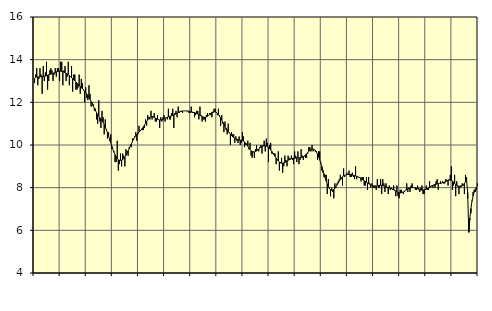
| Category | Tillverkning av verkstadsvaror, SNI 25-30, 33 | Series 1 |
|---|---|---|
| nan | 12.9 | 13.12 |
| 87.0 | 13.3 | 13.18 |
| 87.0 | 13.6 | 13.19 |
| 87.0 | 12.8 | 13.19 |
| 87.0 | 13.1 | 13.19 |
| 87.0 | 13.6 | 13.2 |
| 87.0 | 13.3 | 13.2 |
| 87.0 | 12.4 | 13.2 |
| 87.0 | 13.7 | 13.21 |
| 87.0 | 13 | 13.22 |
| 87.0 | 13.4 | 13.23 |
| 87.0 | 13.9 | 13.25 |
| nan | 12.6 | 13.27 |
| 88.0 | 13 | 13.29 |
| 88.0 | 13.5 | 13.31 |
| 88.0 | 13.6 | 13.32 |
| 88.0 | 13.5 | 13.34 |
| 88.0 | 13 | 13.36 |
| 88.0 | 13.3 | 13.38 |
| 88.0 | 13.6 | 13.4 |
| 88.0 | 13.2 | 13.43 |
| 88.0 | 13.6 | 13.44 |
| 88.0 | 13.6 | 13.46 |
| 88.0 | 13 | 13.46 |
| nan | 13.9 | 13.46 |
| 89.0 | 13.9 | 13.45 |
| 89.0 | 12.8 | 13.44 |
| 89.0 | 13.5 | 13.42 |
| 89.0 | 13.7 | 13.39 |
| 89.0 | 13 | 13.36 |
| 89.0 | 13.2 | 13.34 |
| 89.0 | 13.9 | 13.3 |
| 89.0 | 12.8 | 13.26 |
| 89.0 | 13.2 | 13.21 |
| 89.0 | 13.7 | 13.16 |
| 89.0 | 12.5 | 13.1 |
| nan | 13.3 | 13.05 |
| 90.0 | 13.3 | 13 |
| 90.0 | 12.6 | 12.95 |
| 90.0 | 12.6 | 12.9 |
| 90.0 | 12.7 | 12.85 |
| 90.0 | 13.3 | 12.79 |
| 90.0 | 12.4 | 12.74 |
| 90.0 | 13.1 | 12.69 |
| 90.0 | 12.9 | 12.63 |
| 90.0 | 12.6 | 12.58 |
| 90.0 | 12 | 12.52 |
| 90.0 | 12.7 | 12.46 |
| nan | 12.2 | 12.39 |
| 91.0 | 12.1 | 12.31 |
| 91.0 | 12.8 | 12.23 |
| 91.0 | 12.4 | 12.14 |
| 91.0 | 11.8 | 12.04 |
| 91.0 | 12 | 11.94 |
| 91.0 | 11.9 | 11.82 |
| 91.0 | 11.6 | 11.71 |
| 91.0 | 11.7 | 11.61 |
| 91.0 | 11.2 | 11.51 |
| 91.0 | 11 | 11.42 |
| 91.0 | 12.1 | 11.35 |
| nan | 11.1 | 11.28 |
| 92.0 | 10.8 | 11.21 |
| 92.0 | 11.6 | 11.14 |
| 92.0 | 11.3 | 11.06 |
| 92.0 | 10.5 | 10.96 |
| 92.0 | 11.2 | 10.85 |
| 92.0 | 10.7 | 10.72 |
| 92.0 | 10.3 | 10.57 |
| 92.0 | 10.6 | 10.42 |
| 92.0 | 10.2 | 10.26 |
| 92.0 | 10.5 | 10.1 |
| 92.0 | 9.8 | 9.95 |
| nan | 9.8 | 9.8 |
| 93.0 | 9.7 | 9.66 |
| 93.0 | 9.2 | 9.54 |
| 93.0 | 9.2 | 9.44 |
| 93.0 | 10.2 | 9.37 |
| 93.0 | 8.8 | 9.31 |
| 93.0 | 9.1 | 9.28 |
| 93.0 | 9.6 | 9.28 |
| 93.0 | 9 | 9.29 |
| 93.0 | 9.6 | 9.32 |
| 93.0 | 9.5 | 9.37 |
| 93.0 | 9 | 9.43 |
| nan | 9.8 | 9.51 |
| 94.0 | 9.7 | 9.61 |
| 94.0 | 9.5 | 9.72 |
| 94.0 | 9.9 | 9.83 |
| 94.0 | 10 | 9.95 |
| 94.0 | 9.9 | 10.06 |
| 94.0 | 10.3 | 10.17 |
| 94.0 | 10.3 | 10.27 |
| 94.0 | 10.4 | 10.36 |
| 94.0 | 10.6 | 10.44 |
| 94.0 | 10.2 | 10.5 |
| 94.0 | 10.5 | 10.56 |
| nan | 10.9 | 10.61 |
| 95.0 | 10.7 | 10.66 |
| 95.0 | 10.7 | 10.71 |
| 95.0 | 10.7 | 10.78 |
| 95.0 | 10.7 | 10.85 |
| 95.0 | 10.8 | 10.93 |
| 95.0 | 11.2 | 11.02 |
| 95.0 | 10.9 | 11.1 |
| 95.0 | 11.4 | 11.18 |
| 95.0 | 11.3 | 11.25 |
| 95.0 | 11.2 | 11.3 |
| 95.0 | 11.6 | 11.33 |
| nan | 11.2 | 11.34 |
| 96.0 | 11.3 | 11.33 |
| 96.0 | 11.5 | 11.3 |
| 96.0 | 11.1 | 11.27 |
| 96.0 | 11.1 | 11.24 |
| 96.0 | 11.4 | 11.21 |
| 96.0 | 11.2 | 11.18 |
| 96.0 | 10.8 | 11.17 |
| 96.0 | 11.3 | 11.17 |
| 96.0 | 11.1 | 11.18 |
| 96.0 | 11.3 | 11.2 |
| 96.0 | 11.4 | 11.23 |
| nan | 11.1 | 11.25 |
| 97.0 | 11.3 | 11.28 |
| 97.0 | 11.2 | 11.3 |
| 97.0 | 11.7 | 11.32 |
| 97.0 | 11.2 | 11.34 |
| 97.0 | 11.2 | 11.35 |
| 97.0 | 11.5 | 11.37 |
| 97.0 | 11.7 | 11.39 |
| 97.0 | 10.8 | 11.41 |
| 97.0 | 11.5 | 11.44 |
| 97.0 | 11.6 | 11.46 |
| 97.0 | 11.3 | 11.49 |
| nan | 11.8 | 11.52 |
| 98.0 | 11.5 | 11.55 |
| 98.0 | 11.6 | 11.57 |
| 98.0 | 11.6 | 11.58 |
| 98.0 | 11.5 | 11.59 |
| 98.0 | 11.6 | 11.6 |
| 98.0 | 11.6 | 11.6 |
| 98.0 | 11.6 | 11.6 |
| 98.0 | 11.6 | 11.59 |
| 98.0 | 11.6 | 11.59 |
| 98.0 | 11.5 | 11.58 |
| 98.0 | 11.5 | 11.56 |
| nan | 11.8 | 11.55 |
| 99.0 | 11.5 | 11.54 |
| 99.0 | 11.5 | 11.53 |
| 99.0 | 11.3 | 11.52 |
| 99.0 | 11.4 | 11.5 |
| 99.0 | 11.6 | 11.48 |
| 99.0 | 11.6 | 11.45 |
| 99.0 | 11.2 | 11.42 |
| 99.0 | 11.8 | 11.39 |
| 99.0 | 11.4 | 11.36 |
| 99.0 | 11.1 | 11.33 |
| 99.0 | 11.2 | 11.31 |
| nan | 11.2 | 11.3 |
| 0.0 | 11.1 | 11.31 |
| 0.0 | 11.4 | 11.32 |
| 0.0 | 11.5 | 11.35 |
| 0.0 | 11.4 | 11.39 |
| 0.0 | 11.5 | 11.44 |
| 0.0 | 11.4 | 11.49 |
| 0.0 | 11.3 | 11.53 |
| 0.0 | 11.5 | 11.55 |
| 0.0 | 11.7 | 11.56 |
| 0.0 | 11.7 | 11.56 |
| 0.0 | 11.5 | 11.53 |
| nan | 11.4 | 11.49 |
| 1.0 | 11.7 | 11.43 |
| 1.0 | 11.4 | 11.35 |
| 1.0 | 10.9 | 11.26 |
| 1.0 | 11.4 | 11.17 |
| 1.0 | 11 | 11.07 |
| 1.0 | 10.6 | 10.97 |
| 1.0 | 11.1 | 10.87 |
| 1.0 | 10.7 | 10.79 |
| 1.0 | 10.5 | 10.71 |
| 1.0 | 11 | 10.63 |
| 1.0 | 10.6 | 10.57 |
| nan | 10 | 10.51 |
| 2.0 | 10.6 | 10.45 |
| 2.0 | 10.5 | 10.39 |
| 2.0 | 10.5 | 10.34 |
| 2.0 | 10.1 | 10.31 |
| 2.0 | 10.4 | 10.28 |
| 2.0 | 10.2 | 10.26 |
| 2.0 | 10.1 | 10.25 |
| 2.0 | 10.4 | 10.24 |
| 2.0 | 10 | 10.23 |
| 2.0 | 10.1 | 10.22 |
| 2.0 | 10.6 | 10.21 |
| nan | 10.4 | 10.18 |
| 3.0 | 9.9 | 10.14 |
| 3.0 | 10 | 10.09 |
| 3.0 | 10 | 10.02 |
| 3.0 | 10.2 | 9.94 |
| 3.0 | 9.8 | 9.86 |
| 3.0 | 10.1 | 9.79 |
| 3.0 | 9.5 | 9.73 |
| 3.0 | 9.4 | 9.69 |
| 3.0 | 9.7 | 9.67 |
| 3.0 | 9.4 | 9.67 |
| 3.0 | 9.8 | 9.69 |
| nan | 10 | 9.72 |
| 4.0 | 9.8 | 9.77 |
| 4.0 | 9.7 | 9.81 |
| 4.0 | 9.9 | 9.86 |
| 4.0 | 10 | 9.9 |
| 4.0 | 9.6 | 9.93 |
| 4.0 | 10 | 9.95 |
| 4.0 | 10.2 | 9.96 |
| 4.0 | 9.7 | 9.96 |
| 4.0 | 10.3 | 9.95 |
| 4.0 | 10.1 | 9.92 |
| 4.0 | 9.2 | 9.89 |
| nan | 10 | 9.83 |
| 5.0 | 10.1 | 9.77 |
| 5.0 | 9.6 | 9.7 |
| 5.0 | 9.6 | 9.63 |
| 5.0 | 9.6 | 9.54 |
| 5.0 | 9.6 | 9.46 |
| 5.0 | 9.1 | 9.39 |
| 5.0 | 9.3 | 9.32 |
| 5.0 | 9.7 | 9.25 |
| 5.0 | 8.8 | 9.2 |
| 5.0 | 9.2 | 9.16 |
| 5.0 | 9.4 | 9.15 |
| nan | 8.7 | 9.15 |
| 6.0 | 9 | 9.16 |
| 6.0 | 9.5 | 9.18 |
| 6.0 | 9.3 | 9.21 |
| 6.0 | 9 | 9.25 |
| 6.0 | 9.5 | 9.28 |
| 6.0 | 9.4 | 9.31 |
| 6.0 | 9.3 | 9.34 |
| 6.0 | 9.5 | 9.36 |
| 6.0 | 9.3 | 9.37 |
| 6.0 | 9.1 | 9.38 |
| 6.0 | 9.7 | 9.38 |
| nan | 9.5 | 9.39 |
| 7.0 | 9.2 | 9.4 |
| 7.0 | 9.7 | 9.4 |
| 7.0 | 9.1 | 9.4 |
| 7.0 | 9.3 | 9.4 |
| 7.0 | 9.8 | 9.41 |
| 7.0 | 9.5 | 9.42 |
| 7.0 | 9.3 | 9.45 |
| 7.0 | 9.5 | 9.48 |
| 7.0 | 9.4 | 9.53 |
| 7.0 | 9.4 | 9.59 |
| 7.0 | 9.6 | 9.65 |
| nan | 9.9 | 9.7 |
| 8.0 | 9.9 | 9.75 |
| 8.0 | 9.7 | 9.78 |
| 8.0 | 10 | 9.81 |
| 8.0 | 9.7 | 9.81 |
| 8.0 | 9.8 | 9.79 |
| 8.0 | 9.7 | 9.75 |
| 8.0 | 9.7 | 9.67 |
| 8.0 | 9.3 | 9.57 |
| 8.0 | 9.7 | 9.45 |
| 8.0 | 9.7 | 9.31 |
| 8.0 | 9.2 | 9.15 |
| nan | 8.8 | 8.99 |
| 9.0 | 8.7 | 8.81 |
| 9.0 | 8.5 | 8.64 |
| 9.0 | 8.6 | 8.47 |
| 9.0 | 8.6 | 8.31 |
| 9.0 | 7.7 | 8.17 |
| 9.0 | 8.4 | 8.05 |
| 9.0 | 8 | 7.96 |
| 9.0 | 7.6 | 7.9 |
| 9.0 | 8 | 7.88 |
| 9.0 | 7.8 | 7.89 |
| 9.0 | 7.5 | 7.92 |
| nan | 8.2 | 7.97 |
| 10.0 | 8 | 8.05 |
| 10.0 | 8.2 | 8.13 |
| 10.0 | 8.3 | 8.22 |
| 10.0 | 8.4 | 8.31 |
| 10.0 | 8.6 | 8.39 |
| 10.0 | 8.4 | 8.46 |
| 10.0 | 8.1 | 8.51 |
| 10.0 | 8.9 | 8.55 |
| 10.0 | 8.5 | 8.58 |
| 10.0 | 8.6 | 8.6 |
| 10.0 | 8.7 | 8.61 |
| nan | 8.6 | 8.62 |
| 11.0 | 8.8 | 8.62 |
| 11.0 | 8.5 | 8.62 |
| 11.0 | 8.5 | 8.61 |
| 11.0 | 8.7 | 8.59 |
| 11.0 | 8.5 | 8.58 |
| 11.0 | 8.4 | 8.56 |
| 11.0 | 9 | 8.55 |
| 11.0 | 8.4 | 8.53 |
| 11.0 | 8.5 | 8.51 |
| 11.0 | 8.5 | 8.49 |
| 11.0 | 8.5 | 8.46 |
| nan | 8.3 | 8.43 |
| 12.0 | 8.5 | 8.39 |
| 12.0 | 8.5 | 8.36 |
| 12.0 | 8.1 | 8.32 |
| 12.0 | 8.1 | 8.29 |
| 12.0 | 8.5 | 8.26 |
| 12.0 | 7.9 | 8.22 |
| 12.0 | 8.5 | 8.19 |
| 12.0 | 8.2 | 8.16 |
| 12.0 | 8 | 8.13 |
| 12.0 | 8.2 | 8.11 |
| 12.0 | 8 | 8.09 |
| nan | 8 | 8.08 |
| 13.0 | 8 | 8.08 |
| 13.0 | 7.9 | 8.08 |
| 13.0 | 8.4 | 8.09 |
| 13.0 | 8 | 8.1 |
| 13.0 | 8 | 8.11 |
| 13.0 | 8.4 | 8.11 |
| 13.0 | 7.7 | 8.11 |
| 13.0 | 8.4 | 8.1 |
| 13.0 | 8.2 | 8.08 |
| 13.0 | 7.8 | 8.06 |
| 13.0 | 8.2 | 8.04 |
| nan | 8 | 8.02 |
| 14.0 | 7.7 | 8.01 |
| 14.0 | 8.1 | 7.99 |
| 14.0 | 7.9 | 7.97 |
| 14.0 | 8 | 7.95 |
| 14.0 | 7.9 | 7.93 |
| 14.0 | 8.1 | 7.9 |
| 14.0 | 7.9 | 7.87 |
| 14.0 | 7.6 | 7.84 |
| 14.0 | 8.1 | 7.8 |
| 14.0 | 7.6 | 7.78 |
| 14.0 | 7.5 | 7.76 |
| nan | 7.9 | 7.75 |
| 15.0 | 7.9 | 7.76 |
| 15.0 | 7.8 | 7.78 |
| 15.0 | 7.7 | 7.8 |
| 15.0 | 7.8 | 7.84 |
| 15.0 | 7.9 | 7.88 |
| 15.0 | 8.2 | 7.91 |
| 15.0 | 7.8 | 7.95 |
| 15.0 | 8 | 7.97 |
| 15.0 | 7.8 | 7.99 |
| 15.0 | 8.1 | 8 |
| 15.0 | 8.2 | 8.01 |
| nan | 8 | 8.01 |
| 16.0 | 8 | 8 |
| 16.0 | 7.9 | 7.99 |
| 16.0 | 7.9 | 7.97 |
| 16.0 | 8.1 | 7.95 |
| 16.0 | 8 | 7.93 |
| 16.0 | 7.8 | 7.91 |
| 16.0 | 8 | 7.89 |
| 16.0 | 8.1 | 7.89 |
| 16.0 | 7.7 | 7.89 |
| 16.0 | 7.7 | 7.9 |
| 16.0 | 7.9 | 7.91 |
| nan | 8.1 | 7.93 |
| 17.0 | 7.9 | 7.96 |
| 17.0 | 7.9 | 7.99 |
| 17.0 | 8.3 | 8.02 |
| 17.0 | 8 | 8.06 |
| 17.0 | 8.1 | 8.08 |
| 17.0 | 8 | 8.11 |
| 17.0 | 8.1 | 8.13 |
| 17.0 | 8 | 8.15 |
| 17.0 | 8.3 | 8.16 |
| 17.0 | 8.4 | 8.18 |
| 17.0 | 7.9 | 8.19 |
| nan | 8.2 | 8.2 |
| 18.0 | 8.3 | 8.2 |
| 18.0 | 8.2 | 8.21 |
| 18.0 | 8.3 | 8.23 |
| 18.0 | 8.2 | 8.25 |
| 18.0 | 8.2 | 8.27 |
| 18.0 | 8.4 | 8.3 |
| 18.0 | 8.3 | 8.33 |
| 18.0 | 8.1 | 8.35 |
| 18.0 | 8.4 | 8.36 |
| 18.0 | 8.6 | 8.36 |
| 18.0 | 9 | 8.34 |
| nan | 7.9 | 8.31 |
| 19.0 | 8.1 | 8.26 |
| 19.0 | 8.6 | 8.21 |
| 19.0 | 7.6 | 8.15 |
| 19.0 | 8.3 | 8.1 |
| 19.0 | 8.1 | 8.05 |
| 19.0 | 7.7 | 8.03 |
| 19.0 | 8.1 | 8.02 |
| 19.0 | 8.1 | 8.04 |
| 19.0 | 8.2 | 8.08 |
| 19.0 | 8.1 | 8.14 |
| 19.0 | 7.7 | 8.2 |
| nan | 8.6 | 8.27 |
| 20.0 | 8.5 | 8.35 |
| 20.0 | 7.5 | 7.78 |
| 20.0 | 6.4 | 5.91 |
| 20.0 | 6.5 | 6.56 |
| 20.0 | 6.8 | 7.03 |
| 20.0 | 7.4 | 7.37 |
| 20.0 | 7.8 | 7.61 |
| 20.0 | 7.9 | 7.79 |
| 20.0 | 7.8 | 7.91 |
| 20.0 | 7.9 | 8.01 |
| 20.0 | 8.2 | 8.08 |